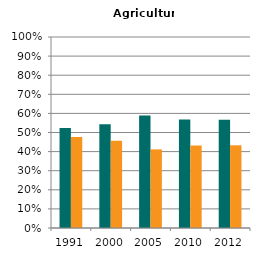
| Category | Male | Female |
|---|---|---|
| 1991.0 | 0.524 | 0.476 |
| 2000.0 | 0.543 | 0.457 |
| 2005.0 | 0.588 | 0.412 |
| 2010.0 | 0.568 | 0.432 |
| 2012.0 | 0.567 | 0.433 |